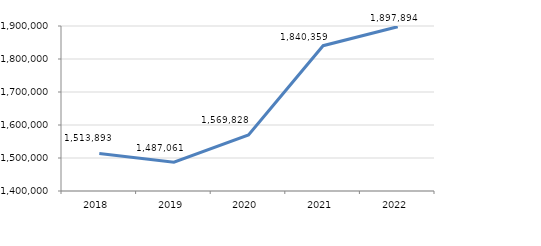
| Category | Series 0 |
|---|---|
| 2018.0 | 1513893 |
| 2019.0 | 1487061.28 |
| 2020.0 | 1569828.12 |
| 2021.0 | 1840359.08 |
| 2022.0 | 1897893.61 |